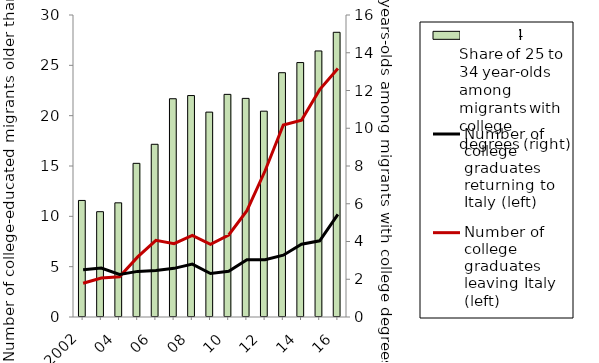
| Category |    25-34 |
|---|---|
| 2002 | 6.175 |
| 03 | 5.579 |
| 04 | 6.048 |
| 05 | 8.141 |
| 06 | 9.15 |
| 07 | 11.563 |
| 08 | 11.732 |
| 09 | 10.855 |
| 10 | 11.795 |
| 11 | 11.582 |
| 12 | 10.904 |
| 13 | 12.943 |
| 14 | 13.48 |
| 15 | 14.095 |
| 16 | 15.084 |